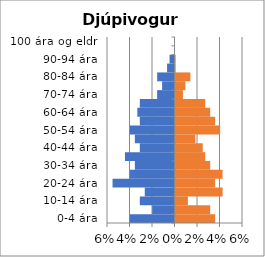
| Category | % karlar | %konur |
|---|---|---|
| 0-4 ára | -0.04 | 0.035 |
| 5-9 ára | -0.02 | 0.031 |
| 10-14 ára | -0.031 | 0.011 |
| 15-19 ára | -0.026 | 0.042 |
| 20-24 ára | -0.055 | 0.035 |
| 25-29 ára | -0.04 | 0.042 |
| 30-34 ára | -0.035 | 0.031 |
| 35-39 ára | -0.044 | 0.026 |
| 40-44 ára | -0.031 | 0.024 |
| 45-49 ára | -0.035 | 0.018 |
| 50-54 ára | -0.04 | 0.04 |
| 55-59 ára | -0.031 | 0.035 |
| 60-64 ára | -0.033 | 0.031 |
| 65-69 ára | -0.031 | 0.026 |
| 70-74 ára | -0.015 | 0.007 |
| 75-79 ára | -0.011 | 0.009 |
| 80-84 ára | -0.015 | 0.013 |
| 85-89 ára | -0.007 | 0 |
| 90-94 ára | -0.004 | 0 |
| 95-99 ára | 0 | 0 |
| 100 ára og eldri | 0 | 0 |